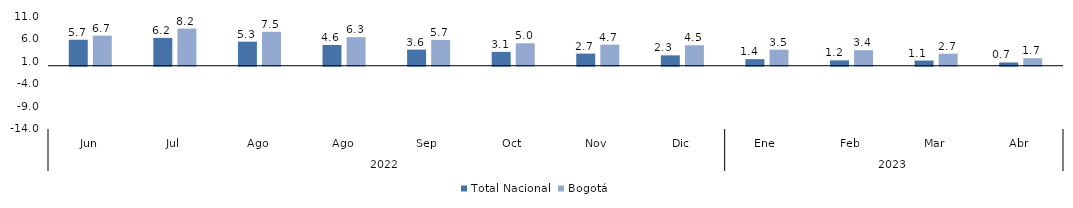
| Category | Total Nacional | Bogotá |
|---|---|---|
| 0 | 5.746 | 6.661 |
| 1 | 6.153 | 8.213 |
| 2 | 5.324 | 7.511 |
| 3 | 4.587 | 6.321 |
| 4 | 3.564 | 5.714 |
| 5 | 3.058 | 4.965 |
| 6 | 2.683 | 4.66 |
| 7 | 2.296 | 4.528 |
| 8 | 1.45 | 3.549 |
| 9 | 1.189 | 3.432 |
| 10 | 1.144 | 2.659 |
| 11 | 0.716 | 1.659 |